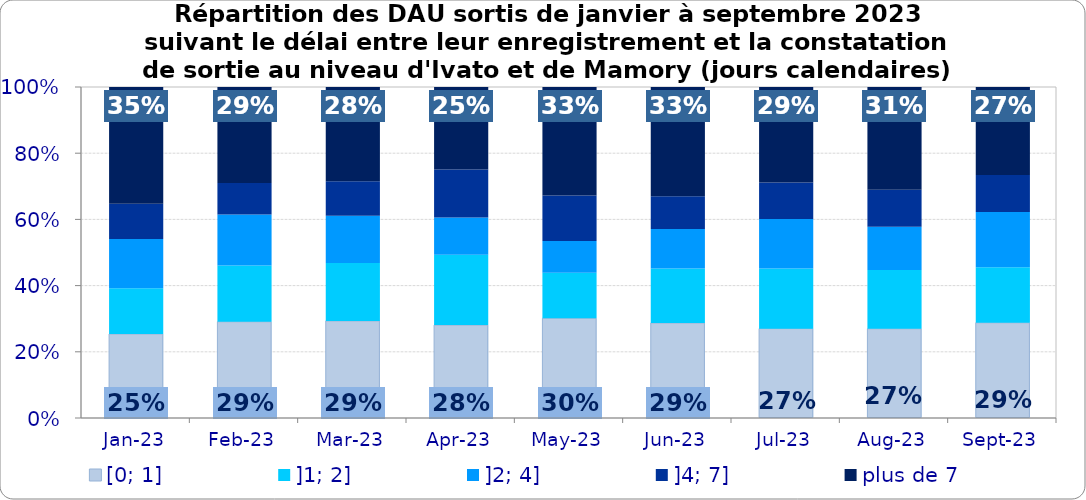
| Category | [0; 1] | ]1; 2] | ]2; 4] | ]4; 7] | plus de 7 |
|---|---|---|---|---|---|
| 2023-01-01 | 0.254 | 0.138 | 0.149 | 0.106 | 0.353 |
| 2023-02-01 | 0.291 | 0.17 | 0.155 | 0.095 | 0.29 |
| 2023-03-01 | 0.293 | 0.175 | 0.143 | 0.104 | 0.284 |
| 2023-04-01 | 0.281 | 0.213 | 0.113 | 0.145 | 0.249 |
| 2023-05-01 | 0.301 | 0.138 | 0.096 | 0.137 | 0.328 |
| 2023-06-01 | 0.287 | 0.165 | 0.119 | 0.099 | 0.33 |
| 2023-07-01 | 0.27 | 0.182 | 0.149 | 0.11 | 0.289 |
| 2023-08-01 | 0.27 | 0.177 | 0.13 | 0.112 | 0.31 |
| 2023-09-01 | 0.288 | 0.167 | 0.167 | 0.112 | 0.266 |